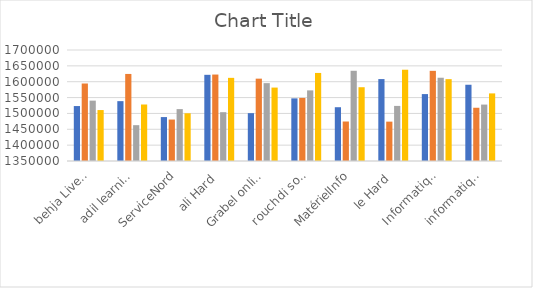
| Category | Trimestre 1 | Trimestre 2 | Trimestre 3 | Trimestre 4 |
|---|---|---|---|---|
| behja LiveSoft | 1523259 | 1594351 | 1540333 | 1510638 |
| adil learning | 1538739 | 1624498 | 1462970 | 1528165 |
| ServiceNord | 1488499 | 1480711 | 1513644 | 1500512 |
| ali Hard | 1621747 | 1622607 | 1503916 | 1612190 |
| Grabel online | 1500889 | 1609646 | 1595493 | 1581513 |
| rouchdi soft | 1547498 | 1548823 | 1572695 | 1627674 |
| MatérielInfo | 1519585 | 1474538 | 1634477 | 1582622 |
| le Hard | 1608313 | 1474117 | 1523705 | 1637796 |
| Informatique SudEst | 1561013 | 1634289 | 1612558 | 1608106 |
| informatique à domicile | 1590434 | 1517908 | 1527909 | 1563160 |